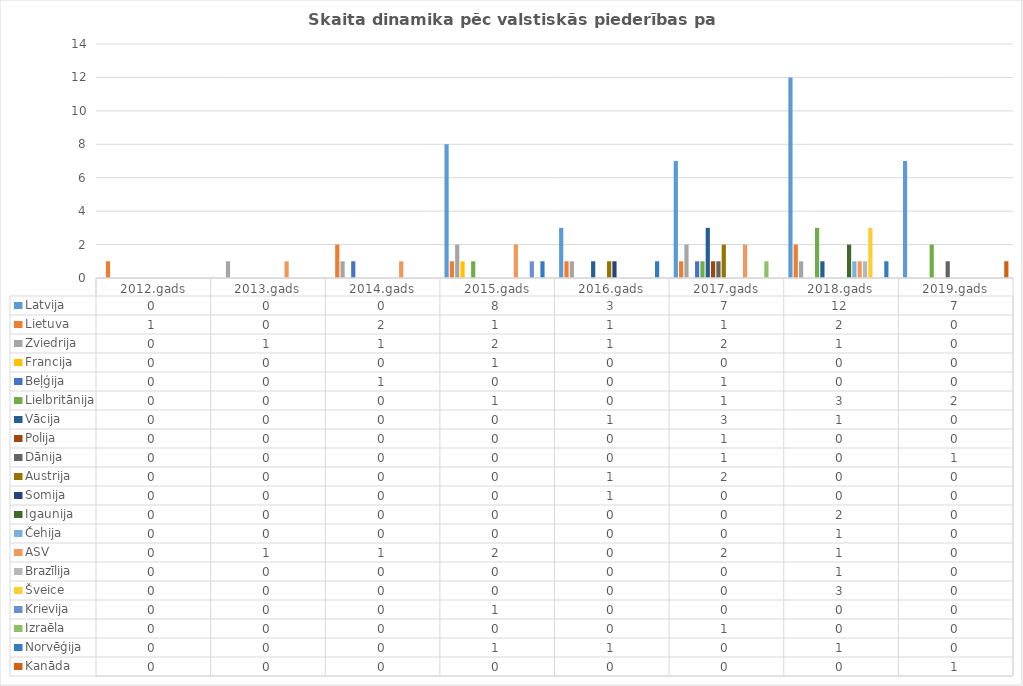
| Category | Latvija | Lietuva | Zviedrija | Francija | Beļģija | Lielbritānija | Vācija | Polija | Dānija | Austrija | Somija | Igaunija | Čehija | ASV | Brazīlija | Šveice | Krievija | Izraēla | Norvēģija | Kanāda |
|---|---|---|---|---|---|---|---|---|---|---|---|---|---|---|---|---|---|---|---|---|
| 2012.gads | 0 | 1 | 0 | 0 | 0 | 0 | 0 | 0 | 0 | 0 | 0 | 0 | 0 | 0 | 0 | 0 | 0 | 0 | 0 | 0 |
| 2013.gads | 0 | 0 | 1 | 0 | 0 | 0 | 0 | 0 | 0 | 0 | 0 | 0 | 0 | 1 | 0 | 0 | 0 | 0 | 0 | 0 |
| 2014.gads | 0 | 2 | 1 | 0 | 1 | 0 | 0 | 0 | 0 | 0 | 0 | 0 | 0 | 1 | 0 | 0 | 0 | 0 | 0 | 0 |
| 2015.gads | 8 | 1 | 2 | 1 | 0 | 1 | 0 | 0 | 0 | 0 | 0 | 0 | 0 | 2 | 0 | 0 | 1 | 0 | 1 | 0 |
| 2016.gads | 3 | 1 | 1 | 0 | 0 | 0 | 1 | 0 | 0 | 1 | 1 | 0 | 0 | 0 | 0 | 0 | 0 | 0 | 1 | 0 |
| 2017.gads | 7 | 1 | 2 | 0 | 1 | 1 | 3 | 1 | 1 | 2 | 0 | 0 | 0 | 2 | 0 | 0 | 0 | 1 | 0 | 0 |
| 2018.gads | 12 | 2 | 1 | 0 | 0 | 3 | 1 | 0 | 0 | 0 | 0 | 2 | 1 | 1 | 1 | 3 | 0 | 0 | 1 | 0 |
| 2019.gads | 7 | 0 | 0 | 0 | 0 | 2 | 0 | 0 | 1 | 0 | 0 | 0 | 0 | 0 | 0 | 0 | 0 | 0 | 0 | 1 |